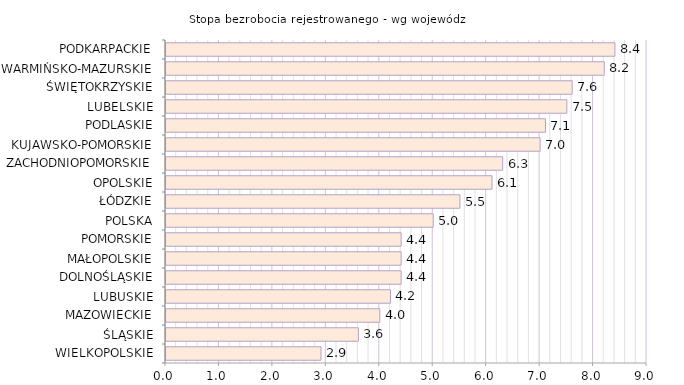
| Category | Stopa bezrobocia rejestrowanego - wg województw |
|---|---|
| WIELKOPOLSKIE | 2.9 |
| ŚLĄSKIE | 3.6 |
| MAZOWIECKIE | 4 |
| LUBUSKIE | 4.2 |
| DOLNOŚLĄSKIE | 4.4 |
| MAŁOPOLSKIE | 4.4 |
| POMORSKIE | 4.4 |
| POLSKA | 5 |
| ŁÓDZKIE | 5.5 |
| OPOLSKIE | 6.1 |
| ZACHODNIOPOMORSKIE | 6.3 |
| KUJAWSKO-POMORSKIE | 7 |
| PODLASKIE | 7.1 |
| LUBELSKIE | 7.5 |
| ŚWIĘTOKRZYSKIE | 7.6 |
| WARMIŃSKO-MAZURSKIE | 8.2 |
| PODKARPACKIE | 8.4 |